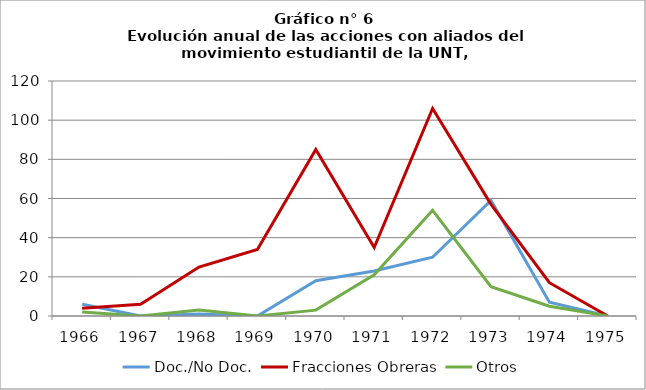
| Category | Doc./No Doc. | Fracciones Obreras | Otros |
|---|---|---|---|
| 1966.0 | 6 | 4 | 2 |
| 1967.0 | 0 | 6 | 0 |
| 1968.0 | 1 | 25 | 3 |
| 1969.0 | 0 | 34 | 0 |
| 1970.0 | 18 | 85 | 3 |
| 1971.0 | 23 | 35 | 21 |
| 1972.0 | 30 | 106 | 54 |
| 1973.0 | 59 | 57 | 15 |
| 1974.0 | 7 | 17 | 5 |
| 1975.0 | 0 | 0 | 0 |